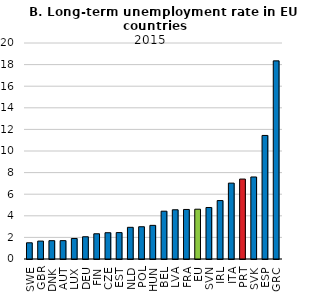
| Category | 2015 |
|---|---|
| SWE | 1.501 |
| GBR | 1.659 |
| DNK | 1.697 |
| AUT | 1.699 |
| LUX | 1.901 |
| DEU | 2.06 |
| FIN | 2.337 |
| CZE | 2.432 |
| EST | 2.445 |
| NLD | 2.933 |
| POL | 2.986 |
| HUN | 3.114 |
| BEL | 4.426 |
| LVA | 4.559 |
| FRA | 4.587 |
| EU | 4.61 |
| SVN | 4.769 |
| IRL | 5.41 |
| ITA | 7.026 |
| PRT | 7.401 |
| SVK | 7.595 |
| ESP | 11.44 |
| GRC | 18.345 |